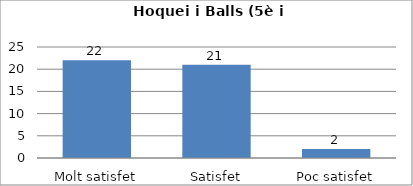
| Category | Series 0 |
|---|---|
| Molt satisfet | 22 |
| Satisfet | 21 |
| Poc satisfet | 2 |